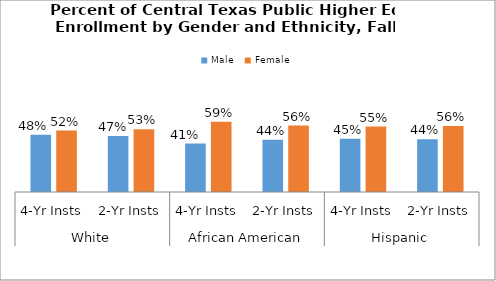
| Category | Male | Female |
|---|---|---|
| 0 | 0.483 | 0.517 |
| 1 | 0.471 | 0.529 |
| 2 | 0.407 | 0.593 |
| 3 | 0.44 | 0.56 |
| 4 | 0.449 | 0.551 |
| 5 | 0.444 | 0.556 |